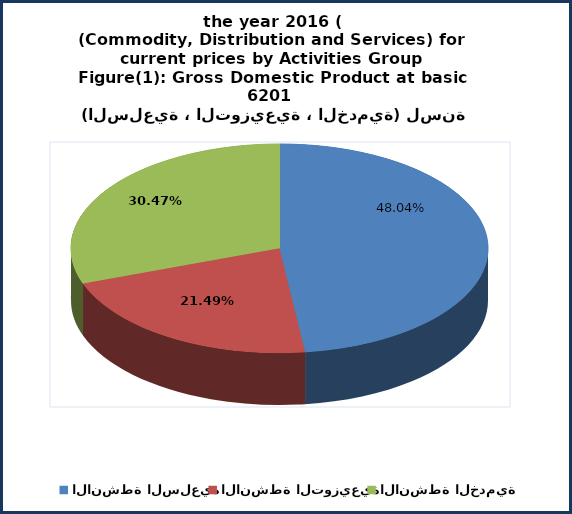
| Category | Series 0 |
|---|---|
| الانشطة السلعية | 98817.9 |
| الانشطة التوزيعية | 44198.2 |
| الانشطة الخدمية | 62663.4 |